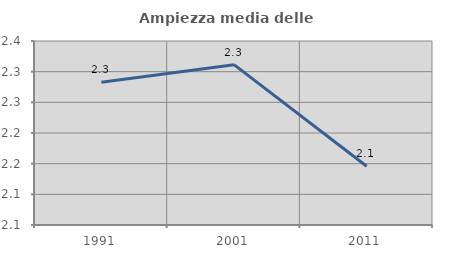
| Category | Ampiezza media delle famiglie |
|---|---|
| 1991.0 | 2.283 |
| 2001.0 | 2.311 |
| 2011.0 | 2.146 |